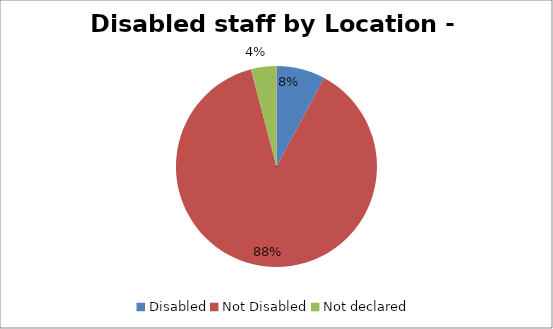
| Category | Leeds |
|---|---|
| Disabled | 0.079 |
| Not Disabled | 0.88 |
| Not declared | 0.041 |